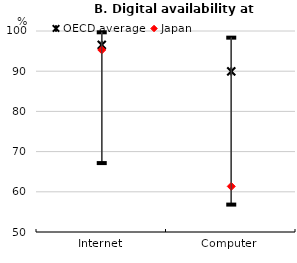
| Category | Longest | OECD average | Japan | Shortest |
|---|---|---|---|---|
| Internet | 99.676 | 96.551 | 95.293 | 67.145 |
| Computer | 98.344 | 89.955 | 61.343 | 56.818 |